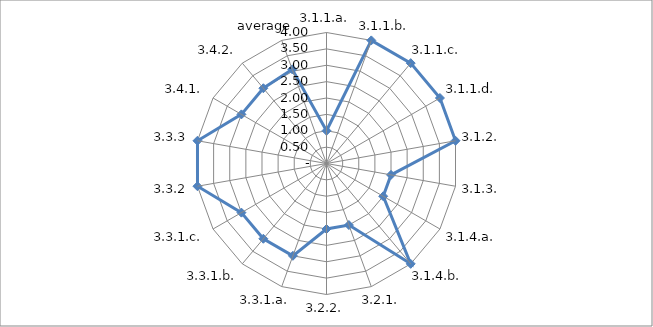
| Category | Series 0 |
|---|---|
| 3.1.1.a. | 1 |
| 3.1.1.b. | 4 |
| 3.1.1.c. | 4 |
| 3.1.1.d. | 4 |
| 3.1.2. | 4 |
| 3.1.3. | 2 |
| 3.1.4.a. | 2 |
| 3.1.4.b. | 4 |
| 3.2.1. | 2 |
| 3.2.2. | 2 |
| 3.3.1.a. | 3 |
| 3.3.1.b. | 3 |
| 3.3.1.c. | 3 |
| 3.3.2 | 4 |
| 3.3.3 | 4 |
| 3.4.1. | 3 |
| 3.4.2. | 3 |
| average | 3.059 |